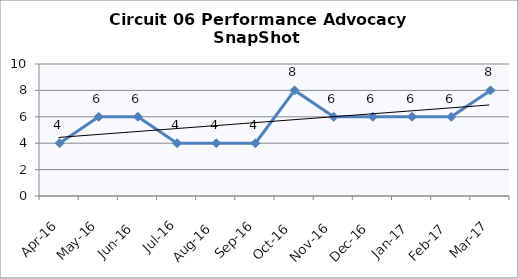
| Category | Circuit 06 |
|---|---|
| Apr-16 | 4 |
| May-16 | 6 |
| Jun-16 | 6 |
| Jul-16 | 4 |
| Aug-16 | 4 |
| Sep-16 | 4 |
| Oct-16 | 8 |
| Nov-16 | 6 |
| Dec-16 | 6 |
| Jan-17 | 6 |
| Feb-17 | 6 |
| Mar-17 | 8 |